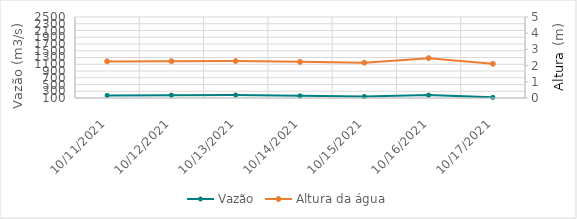
| Category | Vazão |
|---|---|
| 8/1/21 | 569.56 |
| 7/31/21 | 637.71 |
| 7/30/21 | 647.09 |
| 7/29/21 | 620.51 |
| 7/28/21 | 537.93 |
| 7/27/21 | 546.07 |
| 7/26/21 | 553.46 |